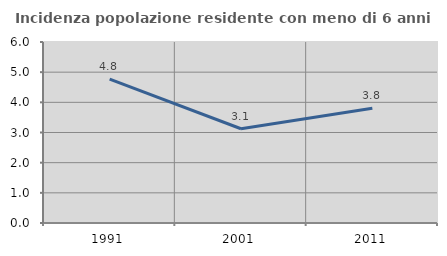
| Category | Incidenza popolazione residente con meno di 6 anni |
|---|---|
| 1991.0 | 4.772 |
| 2001.0 | 3.125 |
| 2011.0 | 3.804 |